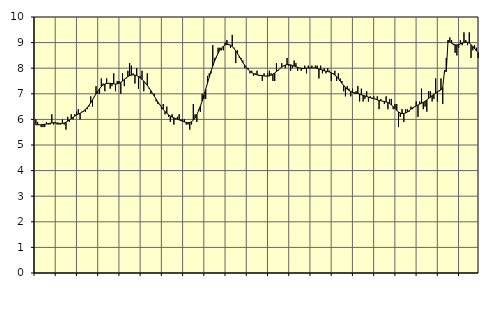
| Category | Piggar | Series 1 |
|---|---|---|
| nan | 6 | 5.79 |
| 1.0 | 5.9 | 5.79 |
| 1.0 | 5.8 | 5.79 |
| 1.0 | 5.7 | 5.79 |
| 1.0 | 5.7 | 5.8 |
| 1.0 | 5.7 | 5.81 |
| 1.0 | 5.9 | 5.82 |
| 1.0 | 5.8 | 5.84 |
| 1.0 | 5.8 | 5.85 |
| 1.0 | 6.2 | 5.86 |
| 1.0 | 5.8 | 5.87 |
| 1.0 | 5.9 | 5.86 |
| nan | 5.8 | 5.86 |
| 2.0 | 5.8 | 5.85 |
| 2.0 | 5.8 | 5.84 |
| 2.0 | 6 | 5.85 |
| 2.0 | 5.8 | 5.86 |
| 2.0 | 5.6 | 5.89 |
| 2.0 | 6.1 | 5.93 |
| 2.0 | 5.9 | 5.98 |
| 2.0 | 6.2 | 6.03 |
| 2.0 | 6 | 6.08 |
| 2.0 | 6.2 | 6.13 |
| 2.0 | 6.3 | 6.17 |
| nan | 6.4 | 6.21 |
| 3.0 | 6 | 6.24 |
| 3.0 | 6.3 | 6.28 |
| 3.0 | 6.3 | 6.33 |
| 3.0 | 6.3 | 6.39 |
| 3.0 | 6.4 | 6.46 |
| 3.0 | 6.5 | 6.55 |
| 3.0 | 6.9 | 6.65 |
| 3.0 | 6.5 | 6.76 |
| 3.0 | 6.9 | 6.88 |
| 3.0 | 7.3 | 7 |
| 3.0 | 7 | 7.11 |
| nan | 7 | 7.2 |
| 4.0 | 7.6 | 7.28 |
| 4.0 | 7.4 | 7.34 |
| 4.0 | 7.1 | 7.38 |
| 4.0 | 7.6 | 7.4 |
| 4.0 | 7.4 | 7.41 |
| 4.0 | 7.2 | 7.41 |
| 4.0 | 7.3 | 7.4 |
| 4.0 | 7.8 | 7.39 |
| 4.0 | 7.1 | 7.38 |
| 4.0 | 7.5 | 7.39 |
| 4.0 | 7.5 | 7.41 |
| nan | 7 | 7.45 |
| 5.0 | 7.8 | 7.5 |
| 5.0 | 7.3 | 7.56 |
| 5.0 | 7.6 | 7.62 |
| 5.0 | 7.9 | 7.67 |
| 5.0 | 8.2 | 7.71 |
| 5.0 | 8.1 | 7.73 |
| 5.0 | 7.8 | 7.74 |
| 5.0 | 7.4 | 7.73 |
| 5.0 | 8 | 7.71 |
| 5.0 | 7.2 | 7.67 |
| 5.0 | 7.7 | 7.62 |
| nan | 7.9 | 7.56 |
| 6.0 | 7.1 | 7.5 |
| 6.0 | 7.4 | 7.42 |
| 6.0 | 7.8 | 7.33 |
| 6.0 | 7.2 | 7.23 |
| 6.0 | 7 | 7.12 |
| 6.0 | 7 | 7.01 |
| 6.0 | 7 | 6.9 |
| 6.0 | 6.7 | 6.79 |
| 6.0 | 6.6 | 6.68 |
| 6.0 | 6.6 | 6.58 |
| 6.0 | 6.4 | 6.48 |
| nan | 6.6 | 6.39 |
| 7.0 | 6.2 | 6.31 |
| 7.0 | 6.5 | 6.24 |
| 7.0 | 6.1 | 6.18 |
| 7.0 | 5.9 | 6.13 |
| 7.0 | 6.2 | 6.09 |
| 7.0 | 5.8 | 6.06 |
| 7.0 | 6 | 6.03 |
| 7.0 | 6.1 | 6.01 |
| 7.0 | 6.2 | 5.98 |
| 7.0 | 6 | 5.95 |
| 7.0 | 6 | 5.93 |
| nan | 6 | 5.9 |
| 8.0 | 5.8 | 5.88 |
| 8.0 | 5.8 | 5.87 |
| 8.0 | 5.6 | 5.88 |
| 8.0 | 5.8 | 5.91 |
| 8.0 | 6.6 | 5.97 |
| 8.0 | 6.2 | 6.06 |
| 8.0 | 5.9 | 6.19 |
| 8.0 | 6.4 | 6.34 |
| 8.0 | 6.3 | 6.52 |
| 8.0 | 7 | 6.72 |
| 8.0 | 6.8 | 6.95 |
| nan | 6.8 | 7.18 |
| 9.0 | 7.7 | 7.41 |
| 9.0 | 7.8 | 7.65 |
| 9.0 | 7.8 | 7.88 |
| 9.0 | 8.9 | 8.09 |
| 9.0 | 8.4 | 8.27 |
| 9.0 | 8.4 | 8.44 |
| 9.0 | 8.8 | 8.58 |
| 9.0 | 8.8 | 8.7 |
| 9.0 | 8.7 | 8.79 |
| 9.0 | 8.7 | 8.86 |
| 9.0 | 9 | 8.91 |
| nan | 9.1 | 8.93 |
| 10.0 | 8.9 | 8.93 |
| 10.0 | 8.8 | 8.9 |
| 10.0 | 9.3 | 8.85 |
| 10.0 | 8.8 | 8.77 |
| 10.0 | 8.2 | 8.68 |
| 10.0 | 8.7 | 8.57 |
| 10.0 | 8.4 | 8.46 |
| 10.0 | 8.4 | 8.34 |
| 10.0 | 8.3 | 8.22 |
| 10.0 | 8 | 8.12 |
| 10.0 | 8 | 8.03 |
| nan | 8 | 7.95 |
| 11.0 | 7.8 | 7.88 |
| 11.0 | 7.9 | 7.83 |
| 11.0 | 7.7 | 7.79 |
| 11.0 | 7.8 | 7.76 |
| 11.0 | 7.9 | 7.74 |
| 11.0 | 7.7 | 7.73 |
| 11.0 | 7.7 | 7.72 |
| 11.0 | 7.5 | 7.71 |
| 11.0 | 7.8 | 7.7 |
| 11.0 | 7.7 | 7.69 |
| 11.0 | 7.8 | 7.69 |
| nan | 7.9 | 7.7 |
| 12.0 | 7.8 | 7.73 |
| 12.0 | 7.5 | 7.77 |
| 12.0 | 7.5 | 7.81 |
| 12.0 | 8.2 | 7.87 |
| 12.0 | 7.9 | 7.93 |
| 12.0 | 8 | 7.99 |
| 12.0 | 8.2 | 8.04 |
| 12.0 | 8.1 | 8.09 |
| 12.0 | 8 | 8.12 |
| 12.0 | 8.4 | 8.14 |
| 12.0 | 8.1 | 8.14 |
| nan | 7.9 | 8.13 |
| 13.0 | 8 | 8.11 |
| 13.0 | 8.3 | 8.08 |
| 13.0 | 8.2 | 8.05 |
| 13.0 | 7.9 | 8.03 |
| 13.0 | 8 | 8.01 |
| 13.0 | 7.9 | 8 |
| 13.0 | 8 | 7.99 |
| 13.0 | 8.1 | 7.99 |
| 13.0 | 7.8 | 8 |
| 13.0 | 8.1 | 8.01 |
| 13.0 | 8 | 8.01 |
| nan | 8.1 | 8.01 |
| 14.0 | 8 | 8.01 |
| 14.0 | 8.1 | 8.01 |
| 14.0 | 8.1 | 7.99 |
| 14.0 | 7.6 | 7.97 |
| 14.0 | 8.1 | 7.95 |
| 14.0 | 7.8 | 7.93 |
| 14.0 | 8 | 7.9 |
| 14.0 | 7.8 | 7.88 |
| 14.0 | 8 | 7.87 |
| 14.0 | 7.9 | 7.85 |
| 14.0 | 7.5 | 7.82 |
| nan | 7.8 | 7.78 |
| 15.0 | 7.9 | 7.73 |
| 15.0 | 7.5 | 7.67 |
| 15.0 | 7.8 | 7.59 |
| 15.0 | 7.6 | 7.5 |
| 15.0 | 7.5 | 7.41 |
| 15.0 | 7.1 | 7.33 |
| 15.0 | 6.9 | 7.25 |
| 15.0 | 7.3 | 7.18 |
| 15.0 | 7.2 | 7.13 |
| 15.0 | 6.9 | 7.09 |
| 15.0 | 7.2 | 7.06 |
| nan | 7 | 7.04 |
| 16.0 | 7.1 | 7.02 |
| 16.0 | 7.3 | 7.01 |
| 16.0 | 6.7 | 6.99 |
| 16.0 | 7.2 | 6.96 |
| 16.0 | 6.7 | 6.94 |
| 16.0 | 6.8 | 6.92 |
| 16.0 | 7.1 | 6.89 |
| 16.0 | 6.7 | 6.87 |
| 16.0 | 6.9 | 6.85 |
| 16.0 | 6.8 | 6.83 |
| 16.0 | 6.9 | 6.81 |
| nan | 6.8 | 6.79 |
| 17.0 | 6.9 | 6.76 |
| 17.0 | 6.4 | 6.74 |
| 17.0 | 6.8 | 6.73 |
| 17.0 | 6.7 | 6.71 |
| 17.0 | 6.6 | 6.7 |
| 17.0 | 6.9 | 6.68 |
| 17.0 | 6.4 | 6.66 |
| 17.0 | 6.8 | 6.62 |
| 17.0 | 6.8 | 6.56 |
| 17.0 | 6.4 | 6.5 |
| 17.0 | 6.6 | 6.43 |
| nan | 6.6 | 6.35 |
| 18.0 | 5.7 | 6.29 |
| 18.0 | 6.1 | 6.25 |
| 18.0 | 6.4 | 6.23 |
| 18.0 | 5.9 | 6.23 |
| 18.0 | 6.4 | 6.25 |
| 18.0 | 6.4 | 6.29 |
| 18.0 | 6.3 | 6.34 |
| 18.0 | 6.5 | 6.4 |
| 18.0 | 6.4 | 6.45 |
| 18.0 | 6.5 | 6.49 |
| 18.0 | 6.7 | 6.53 |
| nan | 6.1 | 6.56 |
| 19.0 | 6.7 | 6.6 |
| 19.0 | 7.2 | 6.63 |
| 19.0 | 6.4 | 6.67 |
| 19.0 | 6.5 | 6.71 |
| 19.0 | 6.3 | 6.76 |
| 19.0 | 7.1 | 6.82 |
| 19.0 | 7.1 | 6.87 |
| 19.0 | 6.7 | 6.93 |
| 19.0 | 6.8 | 6.98 |
| 19.0 | 7.6 | 7.03 |
| 19.0 | 6.7 | 7.08 |
| nan | 7.1 | 7.12 |
| 20.0 | 7.6 | 7.15 |
| 20.0 | 6.6 | 7.25 |
| 20.0 | 7.8 | 7.91 |
| 20.0 | 8.4 | 7.87 |
| 20.0 | 9 | 9.09 |
| 20.0 | 9.2 | 9.03 |
| 20.0 | 9.1 | 8.98 |
| 20.0 | 8.9 | 8.94 |
| 20.0 | 8.6 | 8.91 |
| 20.0 | 8.5 | 8.91 |
| 20.0 | 8.8 | 8.92 |
| nan | 9.1 | 8.95 |
| 21.0 | 8.9 | 8.98 |
| 21.0 | 9.4 | 9 |
| 21.0 | 9.1 | 9.02 |
| 21.0 | 8.9 | 9.01 |
| 21.0 | 9.4 | 8.98 |
| 21.0 | 8.4 | 8.92 |
| 21.0 | 8.7 | 8.85 |
| 21.0 | 8.9 | 8.77 |
| 21.0 | 8.8 | 8.68 |
| 21.0 | 8.4 | 8.61 |